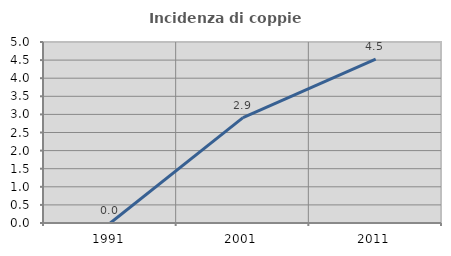
| Category | Incidenza di coppie miste |
|---|---|
| 1991.0 | 0 |
| 2001.0 | 2.909 |
| 2011.0 | 4.528 |